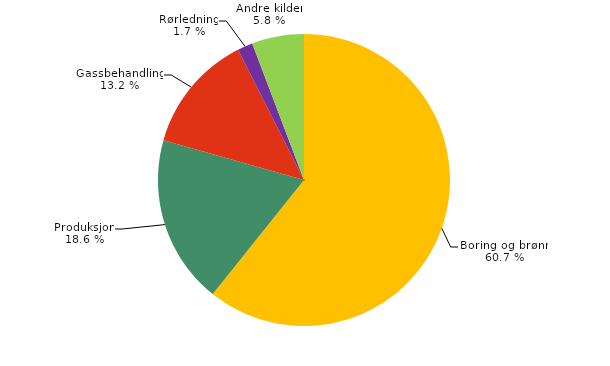
| Category | Series 0 |
|---|---|
| Boring og brønn | 86.818 |
| Produksjon | 26.657 |
| Gassbehandling | 18.797 |
| Rørledning | 2.423 |
| Andre kilder | 8.246 |